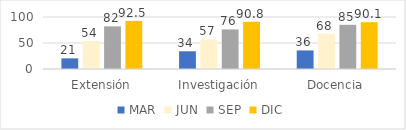
| Category | MAR | JUN | SEP | DIC |
|---|---|---|---|---|
| Extensión | 20.5 | 53.8 | 82 | 92.5 |
| Investigación | 34.1 | 57.1 | 76.1 | 90.8 |
| Docencia | 35.7 | 67.9 | 85 | 90.1 |